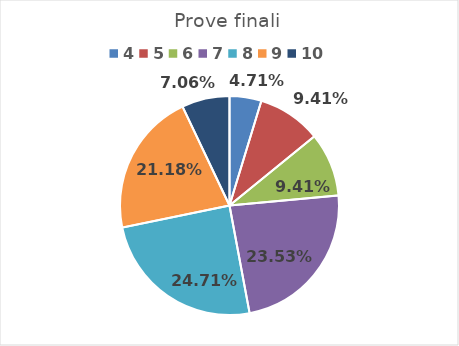
| Category | 7 |
|---|---|
| 4.0 | 0.047 |
| 5.0 | 0.094 |
| 6.0 | 0.094 |
| 7.0 | 0.235 |
| 8.0 | 0.247 |
| 9.0 | 0.212 |
| 10.0 | 0.071 |